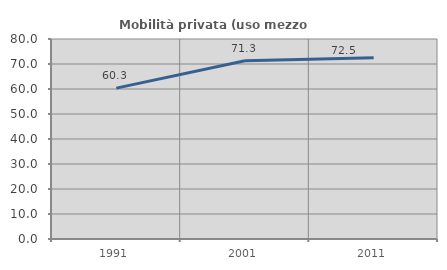
| Category | Mobilità privata (uso mezzo privato) |
|---|---|
| 1991.0 | 60.341 |
| 2001.0 | 71.308 |
| 2011.0 | 72.464 |